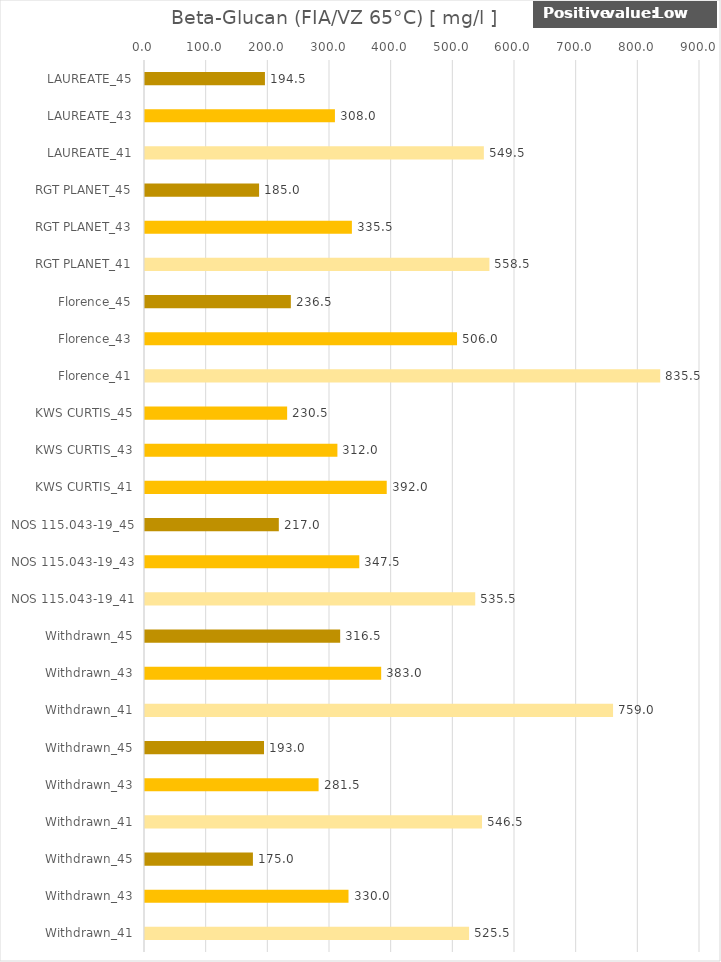
| Category |    Beta-Glucan (FIA/VZ 65°C) [ mg/l ] |
|---|---|
| LAUREATE_45 | 194.5 |
| LAUREATE_43 | 308 |
| LAUREATE_41 | 549.5 |
| RGT PLANET_45 | 185 |
| RGT PLANET_43 | 335.5 |
| RGT PLANET_41 | 558.5 |
| Florence_45 | 236.5 |
| Florence_43 | 506 |
| Florence_41 | 835.5 |
| KWS CURTIS_45 | 230.5 |
| KWS CURTIS_43 | 312 |
| KWS CURTIS_41 | 392 |
| NOS 115.043-19_45 | 217 |
| NOS 115.043-19_43 | 347.5 |
| NOS 115.043-19_41 | 535.5 |
| Withdrawn_45 | 316.5 |
| Withdrawn_43 | 383 |
| Withdrawn_41 | 759 |
| Withdrawn_45 | 193 |
| Withdrawn_43 | 281.5 |
| Withdrawn_41 | 546.5 |
| Withdrawn_45 | 175 |
| Withdrawn_43 | 330 |
| Withdrawn_41 | 525.5 |